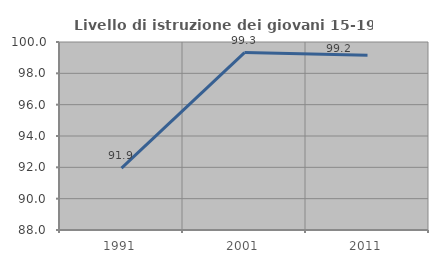
| Category | Livello di istruzione dei giovani 15-19 anni |
|---|---|
| 1991.0 | 91.949 |
| 2001.0 | 99.324 |
| 2011.0 | 99.153 |